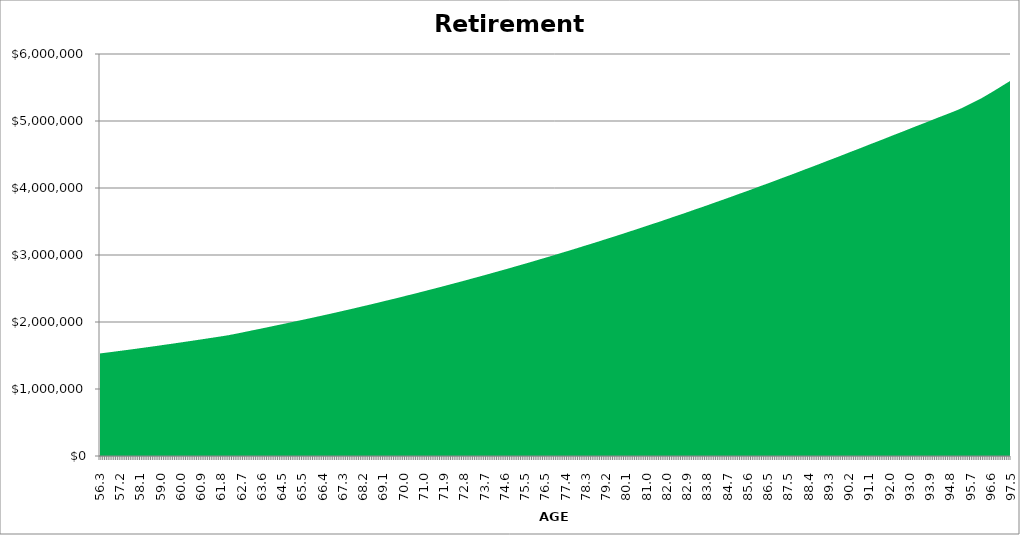
| Category | Retirement Drawdown |
|---|---|
| 56.3 | 1530816.209 |
| 56.4 | 1534189.307 |
| 56.5 | 1537590.841 |
| 56.5 | 1541021.011 |
| 56.6 | 1544480.022 |
| 56.7 | 1547968.076 |
| 56.8 | 1551485.38 |
| 56.9 | 1555032.142 |
| 57.0 | 1558608.569 |
| 57.0 | 1562214.871 |
| 57.1 | 1565851.262 |
| 57.2 | 1569517.952 |
| 57.3 | 1573032.168 |
| 57.4 | 1576575.818 |
| 57.5 | 1580149.112 |
| 57.5 | 1583752.26 |
| 57.6 | 1587385.473 |
| 57.7 | 1591048.964 |
| 57.8 | 1594742.947 |
| 57.9 | 1598467.639 |
| 58.0 | 1602223.257 |
| 58.0 | 1606010.02 |
| 58.1 | 1609828.148 |
| 58.2 | 1613677.865 |
| 58.3 | 1617355.057 |
| 58.4 | 1621062.84 |
| 58.5 | 1624801.428 |
| 58.5 | 1628571.041 |
| 58.6 | 1632371.898 |
| 58.7 | 1636204.221 |
| 58.8 | 1640068.232 |
| 58.9 | 1643964.156 |
| 59.0 | 1647892.218 |
| 59.0 | 1651852.648 |
| 59.1 | 1655845.673 |
| 59.2 | 1659871.525 |
| 59.3 | 1663683.144 |
| 59.4 | 1667526.305 |
| 59.5 | 1671401.232 |
| 59.5 | 1675308.148 |
| 59.6 | 1679247.281 |
| 59.7 | 1683218.859 |
| 59.8 | 1687223.112 |
| 59.9 | 1691260.272 |
| 60.0 | 1695330.57 |
| 60.0 | 1699434.243 |
| 60.1 | 1703571.526 |
| 60.2 | 1707742.657 |
| 60.3 | 1711682.947 |
| 60.4 | 1715655.69 |
| 60.5 | 1719661.116 |
| 60.5 | 1723699.456 |
| 60.6 | 1727770.944 |
| 60.7 | 1731875.814 |
| 60.8 | 1736014.304 |
| 60.9 | 1740186.65 |
| 61.0 | 1744393.094 |
| 61.0 | 1748633.876 |
| 61.1 | 1752909.239 |
| 61.2 | 1757219.429 |
| 61.3 | 1761288.236 |
| 61.4 | 1765390.406 |
| 61.5 | 1769526.176 |
| 61.5 | 1773695.783 |
| 61.6 | 1777899.469 |
| 61.7 | 1782137.473 |
| 61.8 | 1786410.039 |
| 61.9 | 1790717.412 |
| 62.0 | 1795059.054 |
| 62.0 | 1799431.449 |
| 62.1 | 1803834.816 |
| 62.2 | 1809491.57 |
| 62.3 | 1814863.318 |
| 62.4 | 1820273.116 |
| 62.5 | 1825721.234 |
| 62.5 | 1831207.942 |
| 62.6 | 1836733.515 |
| 62.7 | 1842298.227 |
| 62.8 | 1847902.356 |
| 62.9 | 1853546.18 |
| 63.0 | 1859229.982 |
| 63.0 | 1864954.044 |
| 63.1 | 1870718.652 |
| 63.2 | 1876524.092 |
| 63.3 | 1881994.082 |
| 63.4 | 1887502.818 |
| 63.5 | 1893050.574 |
| 63.5 | 1898637.626 |
| 63.6 | 1904264.254 |
| 63.7 | 1909930.737 |
| 63.8 | 1915637.357 |
| 63.9 | 1921384.399 |
| 64.0 | 1927172.15 |
| 64.0 | 1933000.897 |
| 64.1 | 1938870.931 |
| 64.2 | 1944782.545 |
| 64.3 | 1950408.735 |
| 64.4 | 1956074.778 |
| 64.5 | 1961780.955 |
| 64.5 | 1967527.551 |
| 64.6 | 1973314.852 |
| 64.7 | 1979143.146 |
| 64.8 | 1985012.724 |
| 64.9 | 1990923.879 |
| 65.0 | 1996876.904 |
| 65.0 | 2002745.875 |
| 65.1 | 2008656.418 |
| 65.2 | 2014608.827 |
| 65.3 | 2020300.826 |
| 65.4 | 2026033.143 |
| 65.5 | 2031806.064 |
| 65.5 | 2037619.877 |
| 65.6 | 2043474.871 |
| 65.7 | 2049371.337 |
| 65.8 | 2055309.571 |
| 65.9 | 2061289.867 |
| 66.0 | 2067312.523 |
| 66.0 | 2073377.84 |
| 66.1 | 2079486.119 |
| 66.2 | 2085637.665 |
| 66.3 | 2091568.999 |
| 66.4 | 2097542.347 |
| 66.5 | 2103558.005 |
| 66.5 | 2109616.275 |
| 66.6 | 2115717.457 |
| 66.7 | 2121861.856 |
| 66.8 | 2128049.778 |
| 66.9 | 2134281.53 |
| 67.0 | 2140557.425 |
| 67.0 | 2146877.774 |
| 67.1 | 2153242.891 |
| 67.2 | 2159653.096 |
| 67.3 | 2165784.395 |
| 67.4 | 2171959.125 |
| 67.5 | 2178177.592 |
| 67.5 | 2184440.107 |
| 67.6 | 2190746.981 |
| 67.7 | 2197098.529 |
| 67.8 | 2203495.067 |
| 67.9 | 2209936.914 |
| 68.0 | 2216424.391 |
| 68.0 | 2222957.821 |
| 68.1 | 2229537.529 |
| 68.2 | 2236163.843 |
| 68.3 | 2242488.564 |
| 68.4 | 2248858.085 |
| 68.5 | 2255272.723 |
| 68.5 | 2261732.798 |
| 68.6 | 2268238.633 |
| 68.7 | 2274790.55 |
| 68.8 | 2281388.877 |
| 68.9 | 2288033.941 |
| 69.0 | 2294726.075 |
| 69.0 | 2301465.612 |
| 69.1 | 2308252.887 |
| 69.2 | 2315088.238 |
| 69.3 | 2321608.05 |
| 69.4 | 2328174.043 |
| 69.5 | 2334786.545 |
| 69.5 | 2341445.886 |
| 69.6 | 2348152.397 |
| 69.7 | 2354906.413 |
| 69.8 | 2361708.27 |
| 69.9 | 2368558.306 |
| 70.0 | 2375456.864 |
| 70.0 | 2382404.286 |
| 70.1 | 2389400.92 |
| 70.2 | 2396447.112 |
| 70.3 | 2403160.441 |
| 70.4 | 2409921.322 |
| 70.5 | 2416730.092 |
| 70.5 | 2423587.092 |
| 70.6 | 2430492.662 |
| 70.7 | 2437447.146 |
| 70.8 | 2444450.892 |
| 70.9 | 2451504.247 |
| 71.0 | 2458607.563 |
| 71.0 | 2465761.195 |
| 71.1 | 2472965.498 |
| 71.2 | 2480220.831 |
| 71.3 | 2487125.46 |
| 71.4 | 2494078.996 |
| 71.5 | 2501081.786 |
| 71.5 | 2508134.179 |
| 71.6 | 2515236.527 |
| 71.7 | 2522389.183 |
| 71.8 | 2529592.504 |
| 71.9 | 2536846.848 |
| 72.0 | 2544152.577 |
| 72.0 | 2551510.055 |
| 72.1 | 2558919.649 |
| 72.2 | 2566381.727 |
| 72.3 | 2573478.852 |
| 72.4 | 2580626.248 |
| 72.5 | 2587824.271 |
| 72.5 | 2595073.281 |
| 72.6 | 2602373.637 |
| 72.7 | 2609725.704 |
| 72.8 | 2617129.849 |
| 72.9 | 2624586.439 |
| 73.0 | 2632095.847 |
| 73.0 | 2639658.447 |
| 73.1 | 2647274.615 |
| 73.2 | 2654944.731 |
| 73.3 | 2662236.29 |
| 73.4 | 2669579.498 |
| 73.5 | 2676974.72 |
| 73.5 | 2684422.325 |
| 73.6 | 2691922.684 |
| 73.7 | 2699476.17 |
| 73.8 | 2707083.161 |
| 73.9 | 2714744.034 |
| 74.0 | 2722459.171 |
| 74.0 | 2730228.958 |
| 74.1 | 2738053.78 |
| 74.2 | 2745934.028 |
| 74.3 | 2753421.932 |
| 74.4 | 2760962.875 |
| 74.5 | 2768557.233 |
| 74.5 | 2776205.384 |
| 74.6 | 2783907.709 |
| 74.7 | 2791664.593 |
| 74.8 | 2799476.421 |
| 74.9 | 2807343.584 |
| 75.0 | 2815266.471 |
| 75.0 | 2823245.48 |
| 75.1 | 2831281.006 |
| 75.2 | 2839373.45 |
| 75.3 | 2847059.333 |
| 75.4 | 2854799.657 |
| 75.5 | 2862594.808 |
| 75.5 | 2870445.175 |
| 75.6 | 2878351.149 |
| 75.7 | 2886313.124 |
| 75.8 | 2894331.495 |
| 75.9 | 2902406.664 |
| 76.0 | 2910539.032 |
| 76.0 | 2918729.004 |
| 76.1 | 2926976.988 |
| 76.2 | 2935283.395 |
| 76.3 | 2943168.511 |
| 76.4 | 2951109.479 |
| 76.5 | 2959106.696 |
| 76.5 | 2967160.559 |
| 76.6 | 2975271.471 |
| 76.7 | 2983439.836 |
| 76.8 | 2991666.059 |
| 76.9 | 2999950.552 |
| 77.0 | 3008293.726 |
| 77.0 | 3016695.998 |
| 77.1 | 3025157.786 |
| 77.2 | 3033679.511 |
| 77.3 | 3041764.663 |
| 77.4 | 3049907.084 |
| 77.5 | 3058107.181 |
| 77.5 | 3066365.362 |
| 77.6 | 3074682.038 |
| 77.7 | 3083057.624 |
| 77.8 | 3091492.537 |
| 77.9 | 3099987.198 |
| 78.0 | 3108542.029 |
| 78.0 | 3117157.456 |
| 78.1 | 3125833.91 |
| 78.2 | 3134571.822 |
| 78.3 | 3142857.297 |
| 78.4 | 3151201.462 |
| 78.5 | 3159604.73 |
| 78.5 | 3168067.522 |
| 78.6 | 3176590.259 |
| 78.7 | 3185173.365 |
| 78.8 | 3193817.268 |
| 78.9 | 3202522.399 |
| 79.0 | 3211289.191 |
| 79.0 | 3220118.081 |
| 79.1 | 3229009.509 |
| 79.2 | 3237963.919 |
| 79.3 | 3246449.423 |
| 79.4 | 3254995.033 |
| 79.5 | 3263601.175 |
| 79.5 | 3272268.277 |
| 79.6 | 3280996.771 |
| 79.7 | 3289787.091 |
| 79.8 | 3298639.677 |
| 79.9 | 3307554.968 |
| 80.0 | 3316533.409 |
| 80.0 | 3325575.447 |
| 80.1 | 3334681.534 |
| 80.2 | 3343852.121 |
| 80.3 | 3352536.704 |
| 80.4 | 3361282.803 |
| 80.5 | 3370090.853 |
| 80.5 | 3378961.293 |
| 80.6 | 3387894.566 |
| 80.7 | 3396891.116 |
| 80.8 | 3405951.392 |
| 80.9 | 3415075.844 |
| 81.0 | 3424264.928 |
| 81.0 | 3433519.102 |
| 81.1 | 3442838.826 |
| 81.2 | 3452224.564 |
| 81.3 | 3461106.538 |
| 81.4 | 3470051.426 |
| 81.5 | 3479059.673 |
| 81.5 | 3488131.729 |
| 81.6 | 3497268.046 |
| 81.7 | 3506469.078 |
| 81.8 | 3515735.283 |
| 81.9 | 3525067.125 |
| 82.0 | 3534465.067 |
| 82.0 | 3543929.578 |
| 82.1 | 3553461.129 |
| 82.2 | 3563060.195 |
| 82.3 | 3572136.32 |
| 82.4 | 3581276.734 |
| 82.5 | 3590481.893 |
| 82.5 | 3599752.255 |
| 82.6 | 3609088.282 |
| 82.7 | 3618490.439 |
| 82.8 | 3627959.195 |
| 82.9 | 3637495.021 |
| 83.0 | 3647098.392 |
| 83.0 | 3656769.788 |
| 83.1 | 3666509.689 |
| 83.2 | 3676318.581 |
| 83.3 | 3685584.367 |
| 83.4 | 3694915.786 |
| 83.5 | 3704313.302 |
| 83.5 | 3713777.384 |
| 83.6 | 3723308.503 |
| 83.7 | 3732907.135 |
| 83.8 | 3742573.756 |
| 83.9 | 3752308.85 |
| 84.0 | 3762112.9 |
| 84.0 | 3771986.396 |
| 84.1 | 3781929.829 |
| 84.2 | 3791943.695 |
| 84.3 | 3801394.196 |
| 84.4 | 3810911.637 |
| 84.5 | 3820496.494 |
| 84.5 | 3830149.244 |
| 84.6 | 3839870.367 |
| 84.7 | 3849660.349 |
| 84.8 | 3859519.676 |
| 84.9 | 3869448.84 |
| 85.0 | 3879448.335 |
| 85.0 | 3889518.66 |
| 85.1 | 3899660.317 |
| 85.2 | 3909873.81 |
| 85.3 | 3919503.077 |
| 85.4 | 3929200.551 |
| 85.5 | 3938966.715 |
| 85.5 | 3948802.056 |
| 85.6 | 3958707.065 |
| 85.7 | 3968682.234 |
| 85.8 | 3978728.06 |
| 85.9 | 3988845.044 |
| 86.0 | 3999033.69 |
| 86.0 | 4009294.506 |
| 86.1 | 4019628.002 |
| 86.2 | 4030034.694 |
| 86.3 | 4039835.527 |
| 86.4 | 4049705.782 |
| 86.5 | 4059645.951 |
| 86.5 | 4069656.53 |
| 86.6 | 4079738.018 |
| 86.7 | 4089890.915 |
| 86.8 | 4100115.73 |
| 86.9 | 4110412.97 |
| 87.0 | 4120783.148 |
| 87.0 | 4131226.782 |
| 87.1 | 4141744.392 |
| 87.2 | 4152336.502 |
| 87.3 | 4162300.274 |
| 87.4 | 4172334.624 |
| 87.5 | 4182440.049 |
| 87.5 | 4192617.055 |
| 87.6 | 4202866.148 |
| 87.7 | 4213187.839 |
| 87.8 | 4223582.642 |
| 87.9 | 4234051.075 |
| 88.0 | 4244593.659 |
| 88.0 | 4255210.92 |
| 88.1 | 4265903.386 |
| 88.2 | 4276671.59 |
| 88.3 | 4286782.257 |
| 88.4 | 4296964.54 |
| 88.5 | 4307218.948 |
| 88.5 | 4317545.991 |
| 88.6 | 4327946.184 |
| 88.7 | 4338420.045 |
| 88.8 | 4348968.096 |
| 88.9 | 4359590.863 |
| 89.0 | 4370288.874 |
| 89.0 | 4381062.662 |
| 89.1 | 4391912.765 |
| 89.2 | 4402839.723 |
| 89.3 | 4413057.505 |
| 89.4 | 4423347.664 |
| 89.5 | 4433710.711 |
| 89.5 | 4444147.163 |
| 89.6 | 4454657.54 |
| 89.7 | 4465242.365 |
| 89.8 | 4475902.166 |
| 89.9 | 4486637.474 |
| 90.0 | 4497448.824 |
| 90.0 | 4508336.754 |
| 90.1 | 4519301.807 |
| 90.2 | 4530344.529 |
| 90.3 | 4540642.644 |
| 90.4 | 4551013.703 |
| 90.5 | 4561458.224 |
| 90.5 | 4571976.727 |
| 90.6 | 4582569.737 |
| 90.7 | 4593237.78 |
| 90.8 | 4603981.388 |
| 90.9 | 4614801.097 |
| 91.0 | 4625697.445 |
| 91.0 | 4636670.976 |
| 91.1 | 4647722.236 |
| 91.2 | 4658851.776 |
| 91.3 | 4669205.714 |
| 91.4 | 4679632.993 |
| 91.5 | 4690134.132 |
| 91.5 | 4700709.654 |
| 91.6 | 4711360.085 |
| 91.7 | 4722085.958 |
| 91.8 | 4732887.805 |
| 91.9 | 4743766.165 |
| 92.0 | 4754721.581 |
| 92.0 | 4765754.597 |
| 92.1 | 4776865.764 |
| 92.2 | 4788055.634 |
| 92.3 | 4798439.521 |
| 92.4 | 4808896.96 |
| 92.5 | 4819428.473 |
| 92.5 | 4830034.583 |
| 92.6 | 4840715.821 |
| 92.7 | 4851472.717 |
| 92.8 | 4862305.808 |
| 92.9 | 4873215.633 |
| 93.0 | 4884202.736 |
| 93.0 | 4895267.665 |
| 93.1 | 4906410.97 |
| 93.2 | 4917633.207 |
| 93.3 | 4928018.413 |
| 93.4 | 4938477.182 |
| 93.5 | 4949010.033 |
| 93.5 | 4959617.492 |
| 93.6 | 4970300.087 |
| 93.7 | 4981058.351 |
| 93.8 | 4991892.819 |
| 93.9 | 5002804.031 |
| 94.0 | 5013792.531 |
| 94.0 | 5024858.866 |
| 94.1 | 5036003.588 |
| 94.2 | 5047227.252 |
| 94.3 | 5057581.723 |
| 94.4 | 5068009.538 |
| 94.5 | 5078511.217 |
| 94.5 | 5089087.283 |
| 94.6 | 5099738.263 |
| 94.7 | 5110464.687 |
| 94.8 | 5121267.09 |
| 94.9 | 5132146.01 |
| 95.0 | 5143101.989 |
| 95.0 | 5154135.573 |
| 95.1 | 5165247.312 |
| 95.2 | 5176437.758 |
| 95.3 | 5189569.267 |
| 95.4 | 5202793.79 |
| 95.5 | 5216111.987 |
| 95.5 | 5229524.521 |
| 95.6 | 5243032.06 |
| 95.7 | 5256635.278 |
| 95.8 | 5270334.852 |
| 95.9 | 5284131.465 |
| 96.0 | 5298025.804 |
| 96.0 | 5312018.56 |
| 96.1 | 5326110.433 |
| 96.2 | 5340302.123 |
| 96.3 | 5356178.621 |
| 96.4 | 5372167.578 |
| 96.5 | 5388269.79 |
| 96.5 | 5404486.059 |
| 96.6 | 5420817.194 |
| 96.7 | 5437264.007 |
| 96.8 | 5453827.319 |
| 96.9 | 5470507.954 |
| 97.0 | 5487306.744 |
| 97.0 | 5504224.525 |
| 97.1 | 5521262.14 |
| 97.2 | 5538420.439 |
| 97.3 | 5555092.969 |
| 97.4 | 5571883.596 |
| 97.5 | 5588793.157 |
| 97.5 | 5605822.494 |